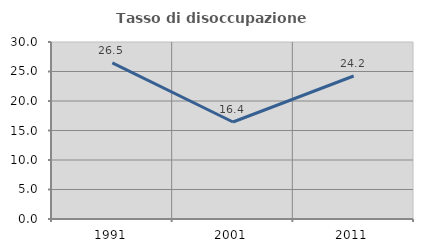
| Category | Tasso di disoccupazione giovanile  |
|---|---|
| 1991.0 | 26.462 |
| 2001.0 | 16.438 |
| 2011.0 | 24.233 |